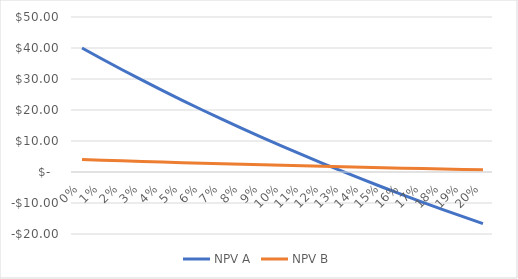
| Category | NPV A | NPV B |
|---|---|---|
| 0.0 | 40 | 4 |
| 0.01 | 36.447 | 3.793 |
| 0.02 | 32.987 | 3.591 |
| 0.03 | 29.616 | 3.394 |
| 0.04 | 26.331 | 3.203 |
| 0.05 | 23.129 | 3.016 |
| 0.06 | 20.007 | 2.834 |
| 0.07 | 16.962 | 2.656 |
| 0.08 | 13.992 | 2.483 |
| 0.09 | 11.093 | 2.314 |
| 0.1 | 8.264 | 2.149 |
| 0.11 | 5.503 | 1.988 |
| 0.12 | 2.806 | 1.83 |
| 0.13 | 0.172 | 1.677 |
| 0.14 | -2.401 | 1.527 |
| 0.15 | -4.915 | 1.38 |
| 0.16 | -7.372 | 1.237 |
| 0.17 | -9.774 | 1.097 |
| 0.18 | -12.123 | 0.959 |
| 0.19 | -14.42 | 0.826 |
| 0.2 | -16.667 | 0.694 |